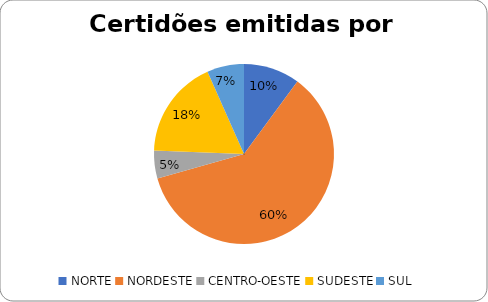
| Category | Series 0 |
|---|---|
| NORTE | 309 |
| NORDESTE | 1849 |
| CENTRO-OESTE | 153 |
| SUDESTE | 542 |
| SUL | 203 |